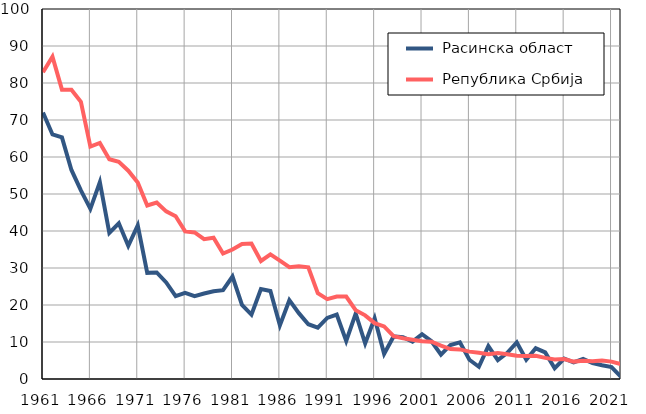
| Category |  Расинска област |  Република Србија |
|---|---|---|
| 1961.0 | 72 | 82.9 |
| 1962.0 | 66.1 | 87.1 |
| 1963.0 | 65.3 | 78.2 |
| 1964.0 | 56.5 | 78.2 |
| 1965.0 | 51 | 74.9 |
| 1966.0 | 46 | 62.8 |
| 1967.0 | 53.2 | 63.8 |
| 1968.0 | 39.5 | 59.4 |
| 1969.0 | 42.1 | 58.7 |
| 1970.0 | 36 | 56.3 |
| 1971.0 | 41.5 | 53.1 |
| 1972.0 | 28.7 | 46.9 |
| 1973.0 | 28.8 | 47.7 |
| 1974.0 | 26.1 | 45.3 |
| 1975.0 | 22.4 | 44 |
| 1976.0 | 23.3 | 39.9 |
| 1977.0 | 22.4 | 39.6 |
| 1978.0 | 23.1 | 37.8 |
| 1979.0 | 23.7 | 38.2 |
| 1980.0 | 24 | 33.9 |
| 1981.0 | 27.7 | 35 |
| 1982.0 | 20 | 36.5 |
| 1983.0 | 17.4 | 36.6 |
| 1984.0 | 24.3 | 31.9 |
| 1985.0 | 23.8 | 33.7 |
| 1986.0 | 14.5 | 32 |
| 1987.0 | 21.3 | 30.2 |
| 1988.0 | 17.8 | 30.5 |
| 1989.0 | 14.8 | 30.2 |
| 1990.0 | 13.9 | 23.2 |
| 1991.0 | 16.5 | 21.6 |
| 1992.0 | 17.4 | 22.3 |
| 1993.0 | 10.3 | 22.3 |
| 1994.0 | 17.7 | 18.6 |
| 1995.0 | 9.6 | 17.2 |
| 1996.0 | 16.4 | 15.1 |
| 1997.0 | 6.8 | 14.2 |
| 1998.0 | 11.5 | 11.6 |
| 1999.0 | 11.3 | 11 |
| 2000.0 | 10.1 | 10.6 |
| 2001.0 | 12.1 | 10.2 |
| 2002.0 | 10.2 | 10.1 |
| 2003.0 | 6.6 | 9 |
| 2004.0 | 9.2 | 8.1 |
| 2005.0 | 9.9 | 8 |
| 2006.0 | 5.2 | 7.4 |
| 2007.0 | 3.3 | 7.1 |
| 2008.0 | 8.9 | 6.7 |
| 2009.0 | 5.1 | 7 |
| 2010.0 | 7.1 | 6.7 |
| 2011.0 | 9.9 | 6.3 |
| 2012.0 | 5.2 | 6.2 |
| 2013.0 | 8.3 | 6.3 |
| 2014.0 | 7.2 | 5.7 |
| 2015.0 | 2.9 | 5.3 |
| 2016.0 | 5.5 | 5.4 |
| 2017.0 | 4.5 | 4.7 |
| 2018.0 | 5.4 | 4.9 |
| 2019.0 | 4.3 | 4.8 |
| 2020.0 | 3.7 | 5 |
| 2021.0 | 3.2 | 4.7 |
| 2022.0 | 0.6 | 4 |